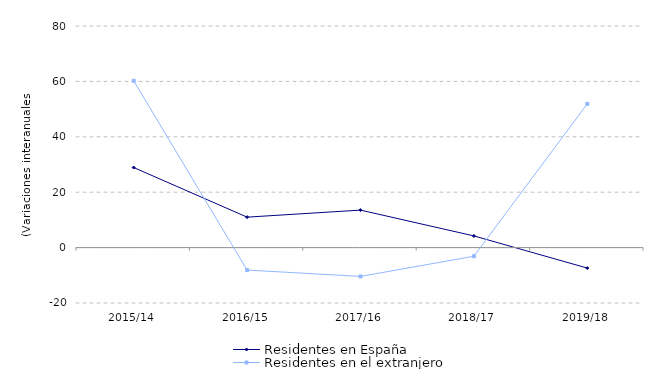
| Category | Residentes en España | Residentes en el extranjero |
|---|---|---|
| 2015/14 | 28.911 | 60.209 |
| 2016/15 | 10.995 | -8.107 |
| 2017/16 | 13.532 | -10.402 |
| 2018/17 | 4.217 | -3.113 |
| 2019/18 | -7.391 | 51.901 |